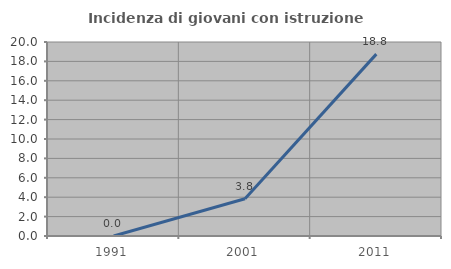
| Category | Incidenza di giovani con istruzione universitaria |
|---|---|
| 1991.0 | 0 |
| 2001.0 | 3.846 |
| 2011.0 | 18.75 |